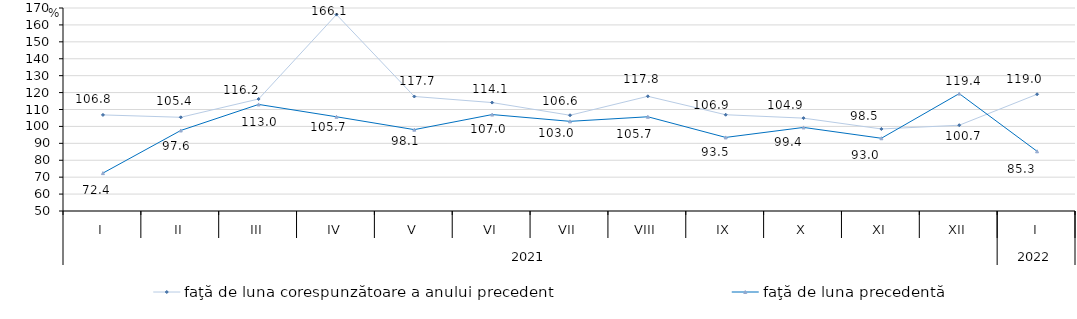
| Category | faţă de luna corespunzătoare a anului precedent | faţă de luna precedentă   |
|---|---|---|
| 0 | 106.8 | 72.4 |
| 1 | 105.4 | 97.6 |
| 2 | 116.2 | 113 |
| 3 | 166.1 | 105.7 |
| 4 | 117.7 | 98.1 |
| 5 | 114.1 | 107 |
| 6 | 106.6 | 103 |
| 7 | 117.8 | 105.7 |
| 8 | 106.9 | 93.5 |
| 9 | 104.9 | 99.4 |
| 10 | 98.5 | 93 |
| 11 | 100.7 | 119.4 |
| 12 | 119 | 85.3 |